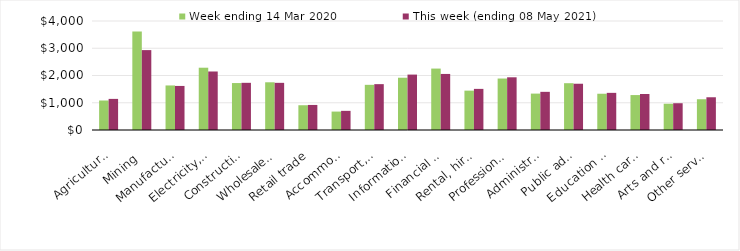
| Category | Week ending 14 Mar 2020 | This week (ending 08 May 2021) |
|---|---|---|
| Agriculture, forestry and fishing | 1082.37 | 1141.59 |
| Mining | 3611.02 | 2931.86 |
| Manufacturing | 1634.82 | 1616.97 |
| Electricity, gas, water and waste services | 2285.76 | 2147.2 |
| Construction | 1722.97 | 1731.3 |
| Wholesale trade | 1750.94 | 1730.64 |
| Retail trade | 908.92 | 919.72 |
| Accommodation and food services | 676.14 | 702.7 |
| Transport, postal and warehousing | 1657.3 | 1682.82 |
| Information media and telecommunications | 1918.38 | 2033.53 |
| Financial and insurance services | 2254.09 | 2057.02 |
| Rental, hiring and real estate services | 1444.33 | 1508.98 |
| Professional, scientific and technical services | 1888.9 | 1934.08 |
| Administrative and support services | 1335.81 | 1400.27 |
| Public administration and safety | 1717.56 | 1697.61 |
| Education and training | 1330.72 | 1363.01 |
| Health care and social assistance | 1281.97 | 1320.27 |
| Arts and recreation services | 964.12 | 982.48 |
| Other services | 1129.09 | 1201.3 |